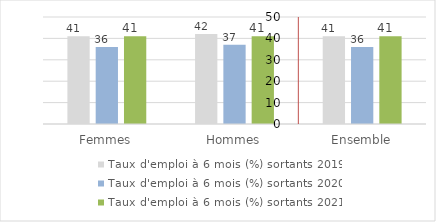
| Category | Taux d'emploi à 6 mois (%) |
|---|---|
| Femmes | 41 |
| Hommes | 41 |
| Ensemble | 41 |